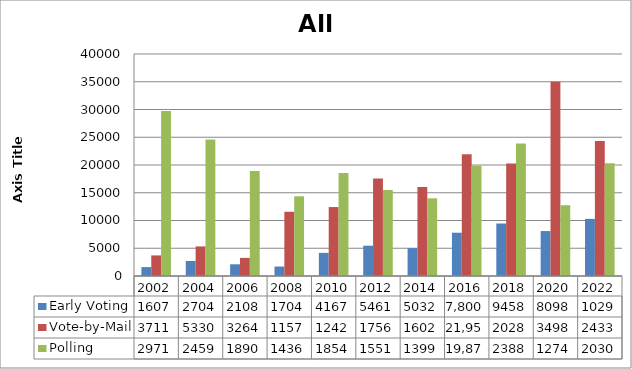
| Category | Early Voting | Vote-by-Mail | Polling |
|---|---|---|---|
| 2002.0 | 1607 | 3711 | 29716 |
| 2004.0 | 2704 | 5330 | 24595 |
| 2006.0 | 2108 | 3264 | 18906 |
| 2008.0 | 1704 | 11576 | 14361 |
| 2010.0 | 4167 | 12423 | 18547 |
| 2012.0 | 5461 | 17563 | 15512 |
| 2014.0 | 5032 | 16020 | 13999 |
| 2016.0 | 7800 | 21955 | 19872 |
| 2018.0 | 9458 | 20286 | 23889 |
| 2020.0 | 8098 | 34983 | 12747 |
| 2022.0 | 10293 | 24330 | 20305 |